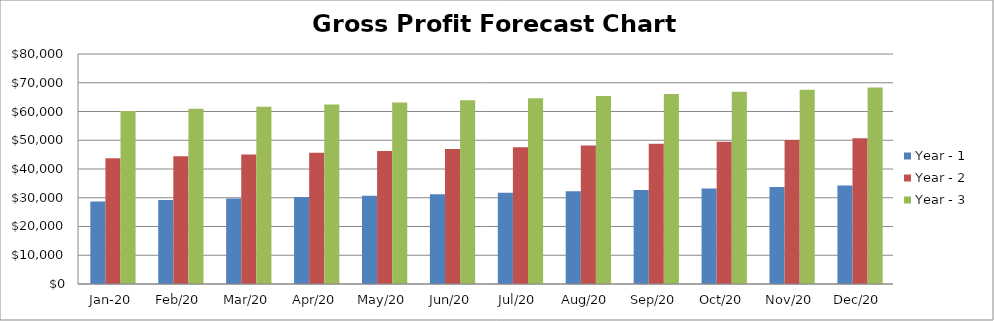
| Category | Year - 1 | Year - 2 | Year - 3 |
|---|---|---|---|
| 2020-01-01 | 28738.5 | 43771.1 | 60212.2 |
| 2020-02-01 | 29238.3 | 44400.9 | 60951 |
| 2020-03-01 | 29738.1 | 45030.7 | 61689.8 |
| 2020-04-01 | 30237.9 | 45660.5 | 62428.6 |
| 2020-05-01 | 30737.7 | 46290.3 | 63167.4 |
| 2020-06-01 | 31237.5 | 46920.1 | 63906.2 |
| 2020-07-01 | 31737.3 | 47549.9 | 64645 |
| 2020-08-01 | 32237.1 | 48179.7 | 65383.8 |
| 2020-09-01 | 32736.9 | 48809.5 | 66122.6 |
| 2020-10-01 | 33236.7 | 49439.3 | 66861.4 |
| 2020-11-01 | 33736.5 | 50069.1 | 67600.2 |
| 2020-12-01 | 34236.3 | 50698.9 | 68339 |